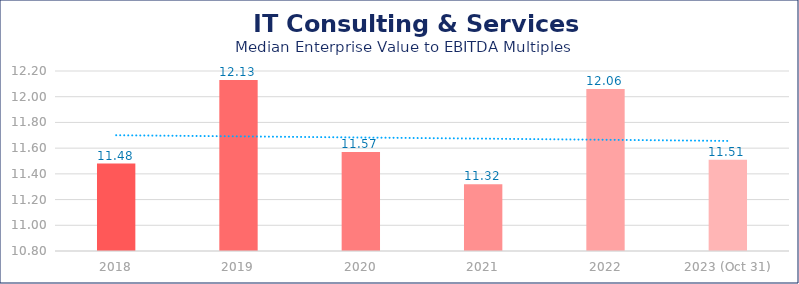
| Category | IT Consulting & Services |
|---|---|
| 2018 | 11.48 |
| 2019 | 12.13 |
| 2020 | 11.57 |
| 2021 | 11.32 |
| 2022 | 12.06 |
| 2023 (Oct 31) | 11.51 |